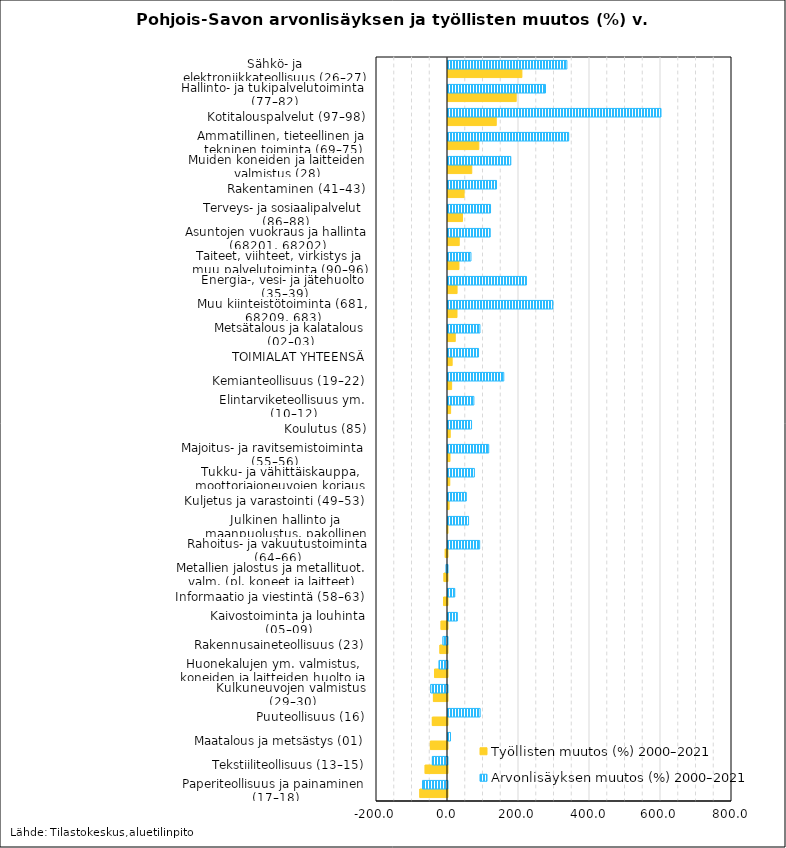
| Category | Työllisten muutos (%) 2000–2021 | Arvonlisäyksen muutos (%) 2000–2021 |
|---|---|---|
| Paperiteollisuus ja painaminen (17–18) | -77.859 | -70.419 |
| Tekstiiliteollisuus (13–15) | -62.973 | -42.745 |
| Maatalous ja metsästys (01) | -48.182 | 7.042 |
| Puuteollisuus (16) | -42.677 | 90.445 |
| Kulkuneuvojen valmistus (29–30) | -39.623 | -46.988 |
| Huonekalujen ym. valmistus, koneiden ja laitteiden huolto ja asennus (31–33) | -36.483 | -23.497 |
| Rakennusaineteollisuus (23) | -21.284 | -12.536 |
| Kaivostoiminta ja louhinta (05–09) | -18.052 | 26.316 |
| Informaatio ja viestintä (58–63) | -11.013 | 19.094 |
| Metallien jalostus ja metallituot. valm. (pl. koneet ja laitteet) (24–25) | -9.867 | -3.824 |
| Rahoitus- ja vakuutustoiminta (64–66) | -6.318 | 89.201 |
| Julkinen hallinto ja maanpuolustus, pakollinen sosiaalivakuutus (84) | -0.642 | 57.931 |
| Kuljetus ja varastointi (49–53) | 3.125 | 51.42 |
| Tukku- ja vähittäiskauppa, moottoriajoneuvojen korjaus (45–47) | 5.022 | 74.288 |
| Majoitus- ja ravitsemistoiminta (55–56) | 5.677 | 114.669 |
| Koulutus (85) | 6.336 | 66.32 |
| Elintarviketeollisuus ym. (10–12) | 7.37 | 72.865 |
| Kemianteollisuus (19–22) | 10.241 | 157.091 |
| TOIMIALAT YHTEENSÄ | 11.737 | 85.888 |
| Metsätalous ja kalatalous (02–03) | 20.47 | 89.945 |
| Muu kiinteistötoiminta (681, 68209, 683) | 25.38 | 295.455 |
| Energia-, vesi- ja jätehuolto (35–39) | 25.577 | 220.979 |
| Taiteet, viihteet, virkistys ja muu palvelutoiminta (90–96) | 30.883 | 64.615 |
| Asuntojen vuokraus ja hallinta (68201, 68202) | 31.655 | 118.863 |
| Terveys- ja sosiaalipalvelut (86–88) | 40.802 | 119.775 |
| Rakentaminen (41–43) | 45.316 | 136.581 |
| Muiden koneiden ja laitteiden valmistus (28) | 66.957 | 176.93 |
| Ammatillinen, tieteellinen ja tekninen toiminta (69–75) | 86.872 | 339.833 |
| Kotitalouspalvelut (97–98) | 135.969 | 600 |
| Hallinto- ja tukipalvelutoiminta (77–82) | 192.091 | 274.623 |
| Sähkö- ja elektroniikkateollisuus (26–27) | 208.182 | 334.896 |